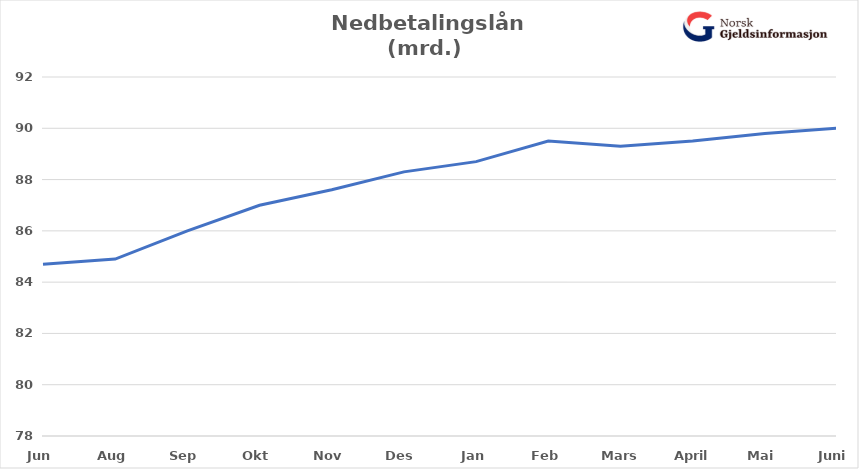
| Category | Nedbetalingslån |
|---|---|
| Jun | 84.7 |
| Aug | 84.9 |
| Sep | 86 |
| Okt | 87 |
| Nov | 87.6 |
| Des | 88.3 |
| Jan | 88.7 |
| Feb | 89.5 |
| Mars | 89.3 |
| April | 89.5 |
| Mai | 89.8 |
| Juni | 90 |